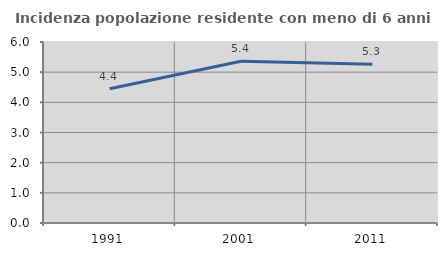
| Category | Incidenza popolazione residente con meno di 6 anni |
|---|---|
| 1991.0 | 4.448 |
| 2001.0 | 5.361 |
| 2011.0 | 5.265 |